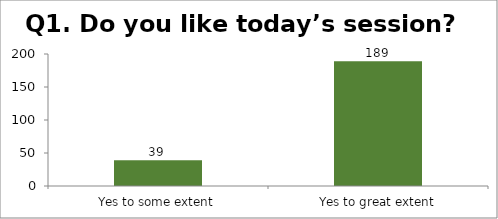
| Category | Q1. Do you like today’s session? |
|---|---|
| Yes to some extent | 39 |
| Yes to great extent | 189 |